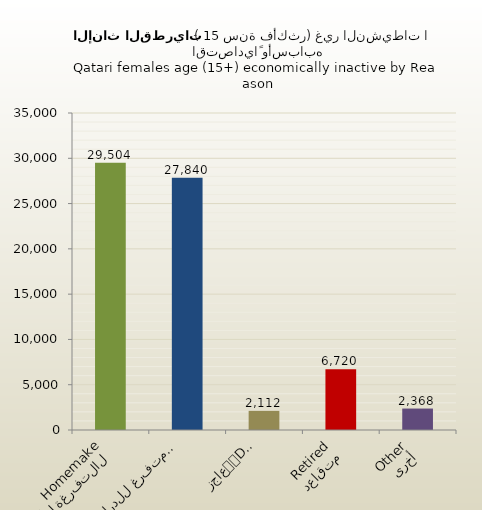
| Category | الاناث القطريات |
|---|---|
| التفرغة لأعمال المنزل
Homemaker | 29504 |
| متفرغ للدراسة
Student | 27840 |
| عاجز
Disabled | 2112 |
| متقاعد
Retired | 6720 |
| أخرى
Other | 2368 |